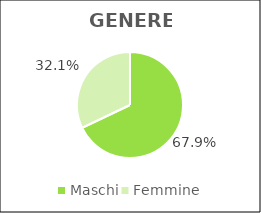
| Category | Series 0 |
|---|---|
| Maschi | 47685 |
| Femmine | 22530 |